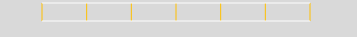
| Category | Series 0 |
|---|---|
| 0.0 | 1 |